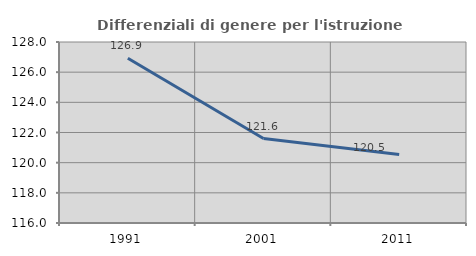
| Category | Differenziali di genere per l'istruzione superiore |
|---|---|
| 1991.0 | 126.925 |
| 2001.0 | 121.599 |
| 2011.0 | 120.548 |